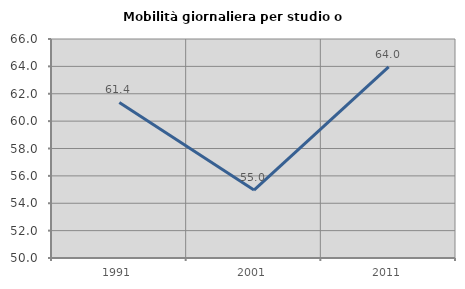
| Category | Mobilità giornaliera per studio o lavoro |
|---|---|
| 1991.0 | 61.364 |
| 2001.0 | 54.963 |
| 2011.0 | 63.961 |